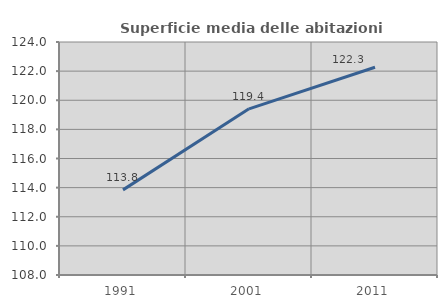
| Category | Superficie media delle abitazioni occupate |
|---|---|
| 1991.0 | 113.845 |
| 2001.0 | 119.409 |
| 2011.0 | 122.265 |